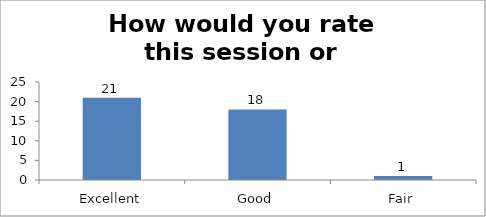
| Category | How would you rate this session or workshop? |
|---|---|
| Excellent | 21 |
| Good | 18 |
| Fair | 1 |